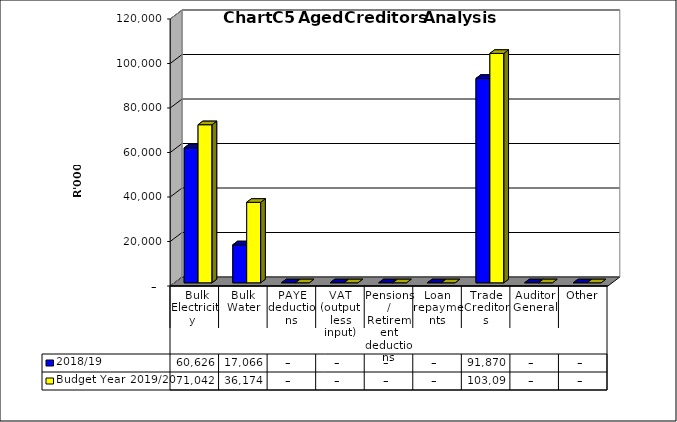
| Category | 2018/19 | Budget Year 2019/20 |
|---|---|---|
|  Bulk Electricity  | 60626138.57 | 71041865.25 |
| Bulk Water | 17066378.8 | 36174210.95 |
| PAYE deductions | 0 | 0 |
| VAT (output less input) | 0 | 0 |
| Pensions / Retirement deductions | 0 | 0 |
| Loan repayments | 0 | 0 |
| Trade Creditors | 91869605.64 | 103097898.55 |
| Auditor General | 0 | 0 |
| Other | 0 | 0 |